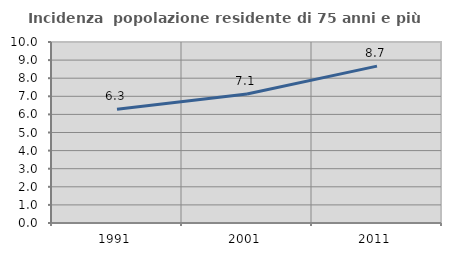
| Category | Incidenza  popolazione residente di 75 anni e più |
|---|---|
| 1991.0 | 6.289 |
| 2001.0 | 7.129 |
| 2011.0 | 8.667 |